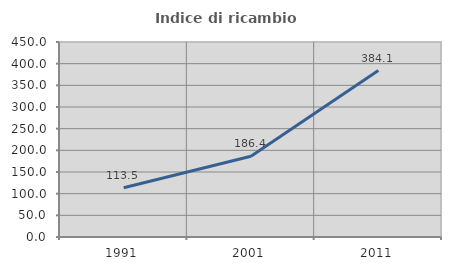
| Category | Indice di ricambio occupazionale  |
|---|---|
| 1991.0 | 113.514 |
| 2001.0 | 186.364 |
| 2011.0 | 384.091 |